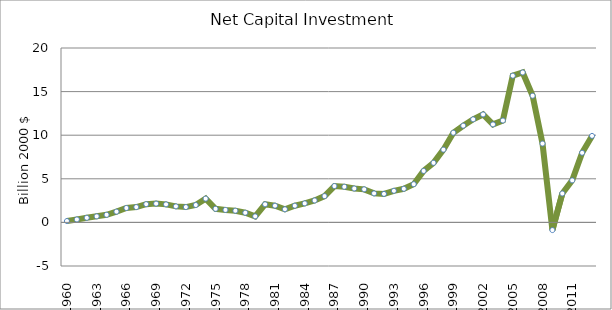
| Category | Series 0 |
|---|---|
| 1960.0 | 0.159 |
| 1961.0 | 0.335 |
| 1962.0 | 0.527 |
| 1963.0 | 0.696 |
| 1964.0 | 0.872 |
| 1965.0 | 1.232 |
| 1966.0 | 1.652 |
| 1967.0 | 1.755 |
| 1968.0 | 2.091 |
| 1969.0 | 2.155 |
| 1970.0 | 2.067 |
| 1971.0 | 1.838 |
| 1972.0 | 1.758 |
| 1973.0 | 1.996 |
| 1974.0 | 2.723 |
| 1975.0 | 1.556 |
| 1976.0 | 1.43 |
| 1977.0 | 1.339 |
| 1978.0 | 1.107 |
| 1979.0 | 0.695 |
| 1980.0 | 2.073 |
| 1981.0 | 1.917 |
| 1982.0 | 1.505 |
| 1983.0 | 1.913 |
| 1984.0 | 2.18 |
| 1985.0 | 2.515 |
| 1986.0 | 3.014 |
| 1987.0 | 4.167 |
| 1988.0 | 4.086 |
| 1989.0 | 3.888 |
| 1990.0 | 3.79 |
| 1991.0 | 3.326 |
| 1992.0 | 3.271 |
| 1993.0 | 3.624 |
| 1994.0 | 3.856 |
| 1995.0 | 4.382 |
| 1996.0 | 5.903 |
| 1997.0 | 6.83 |
| 1998.0 | 8.341 |
| 1999.0 | 10.281 |
| 2000.0 | 11.091 |
| 2001.0 | 11.819 |
| 2002.0 | 12.38 |
| 2003.0 | 11.238 |
| 2004.0 | 11.683 |
| 2005.0 | 16.825 |
| 2006.0 | 17.191 |
| 2007.0 | 14.524 |
| 2008.0 | 9.04 |
| 2009.0 | -0.882 |
| 2010.0 | 3.315 |
| 2011.0 | 4.818 |
| 2012.0 | 7.984 |
| 2013.0 | 9.92 |